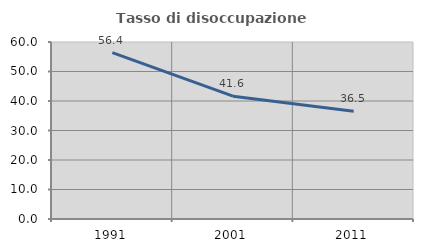
| Category | Tasso di disoccupazione giovanile  |
|---|---|
| 1991.0 | 56.387 |
| 2001.0 | 41.643 |
| 2011.0 | 36.543 |